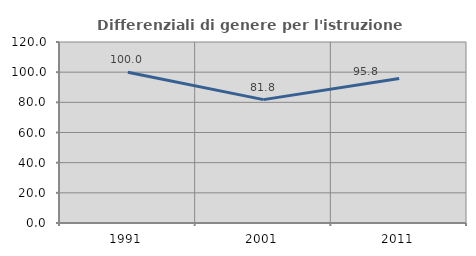
| Category | Differenziali di genere per l'istruzione superiore |
|---|---|
| 1991.0 | 99.989 |
| 2001.0 | 81.803 |
| 2011.0 | 95.828 |